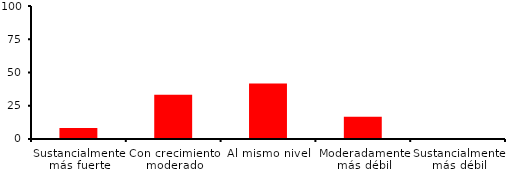
| Category | Series 0 |
|---|---|
| Sustancialmente más fuerte | 8.333 |
| Con crecimiento moderado | 33.333 |
| Al mismo nivel | 41.667 |
| Moderadamente más débil | 16.667 |
| Sustancialmente más débil | 0 |